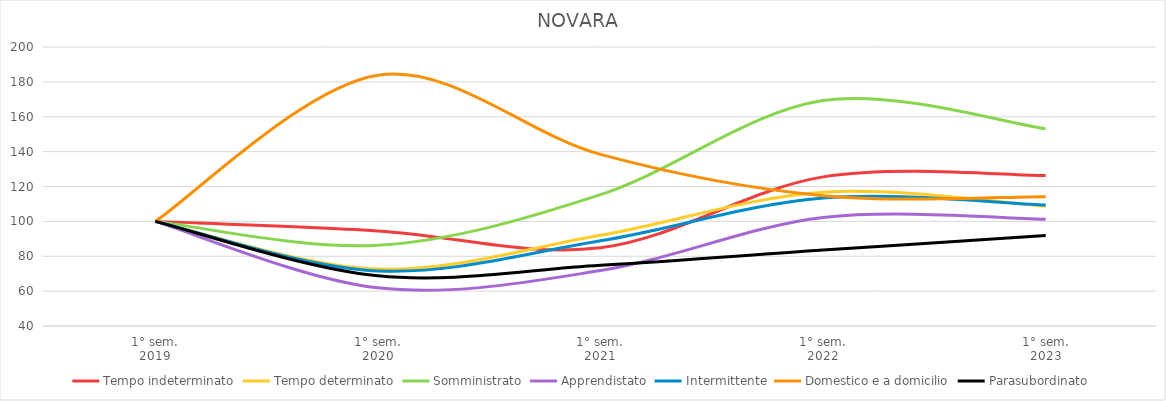
| Category | Tempo indeterminato | Tempo determinato | Somministrato | Apprendistato | Intermittente | Domestico e a domicilio | Parasubordinato |
|---|---|---|---|---|---|---|---|
| 1° sem.
2019 | 100 | 100 | 100 | 100 | 100 | 100 | 100 |
| 1° sem.
2020 | 94.546 | 72.63 | 86.265 | 61.872 | 71.554 | 183.804 | 68.774 |
| 1° sem.
2021 | 84.834 | 92.038 | 115.316 | 71.777 | 88.862 | 138.405 | 74.867 |
| 1° sem.
2022 | 125.514 | 116.762 | 169.269 | 102.171 | 113.381 | 114.724 | 83.549 |
| 1° sem.
2023 | 126.298 | 108.812 | 153.113 | 101.221 | 109.375 | 114.11 | 91.851 |